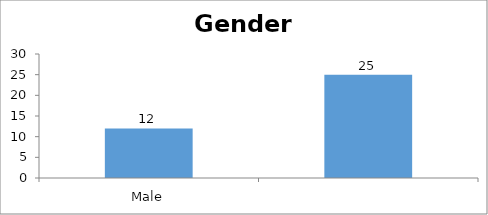
| Category | Gender |
|---|---|
| Male | 12 |